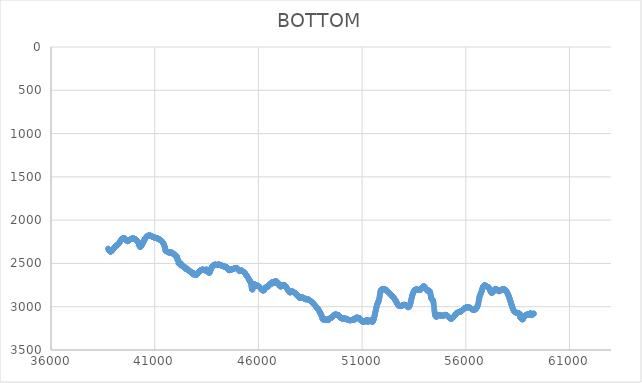
| Category | BOTTOM |
|---|---|
| 38756.673 | 2328.51 |
| 38766.9131 | 2334.84 |
| 38777.1532 | 2340.42 |
| 38787.3933 | 2345.3 |
| 38797.6334 | 2349.51 |
| 38807.8735 | 2353.06 |
| 38818.1136 | 2356 |
| 38828.3537 | 2358.34 |
| 38838.5938 | 2360.12 |
| 38848.8339 | 2361.37 |
| 38859.0741 | 2362.11 |
| 38869.3142 | 2362.38 |
| 38879.5543 | 2362.2 |
| 38889.7944 | 2361.6 |
| 38900.0345 | 2360.6 |
| 38910.2746 | 2359.25 |
| 38920.5147 | 2357.57 |
| 38930.7548 | 2355.58 |
| 38940.9949 | 2353.31 |
| 38951.235 | 2350.8 |
| 38961.4751 | 2348.07 |
| 38971.7152 | 2345.16 |
| 38981.9553 | 2342.08 |
| 38992.1954 | 2338.87 |
| 39002.4356 | 2335.55 |
| 39012.6757 | 2332.16 |
| 39022.9158 | 2328.73 |
| 39033.1559 | 2325.28 |
| 39043.396 | 2321.84 |
| 39053.6361 | 2318.44 |
| 39063.8762 | 2315.11 |
| 39074.1163 | 2311.88 |
| 39084.3564 | 2308.77 |
| 39094.5965 | 2305.82 |
| 39104.8366 | 2303.05 |
| 39115.0767 | 2300.5 |
| 39125.3168 | 2298.18 |
| 39135.557 | 2296.14 |
| 39145.7971 | 2294.38 |
| 39156.0372 | 2292.84 |
| 39166.2773 | 2291.47 |
| 39176.5174 | 2290.19 |
| 39186.7575 | 2288.92 |
| 39196.9976 | 2287.61 |
| 39207.2377 | 2286.17 |
| 39217.4778 | 2284.55 |
| 39227.7179 | 2282.67 |
| 39237.958 | 2280.45 |
| 39248.1981 | 2277.84 |
| 39258.4382 | 2274.78 |
| 39268.6783 | 2271.33 |
| 39278.9185 | 2267.57 |
| 39289.1586 | 2263.57 |
| 39299.3987 | 2259.4 |
| 39309.6388 | 2255.15 |
| 39319.8789 | 2250.89 |
| 39330.119 | 2246.7 |
| 39340.3591 | 2242.65 |
| 39350.5992 | 2238.81 |
| 39360.8393 | 2235.2 |
| 39371.0794 | 2231.81 |
| 39381.3195 | 2228.65 |
| 39391.5596 | 2225.72 |
| 39401.7997 | 2223.02 |
| 39412.0399 | 2220.55 |
| 39422.28 | 2218.33 |
| 39432.5201 | 2216.34 |
| 39442.7602 | 2214.59 |
| 39453.0003 | 2213.09 |
| 39463.2404 | 2211.83 |
| 39473.4805 | 2210.83 |
| 39483.7206 | 2210.09 |
| 39493.9607 | 2209.62 |
| 39504.2008 | 2209.42 |
| 39514.4409 | 2209.51 |
| 39524.681 | 2209.89 |
| 39534.9211 | 2210.57 |
| 39545.1612 | 2211.55 |
| 39555.4014 | 2212.85 |
| 39565.6415 | 2214.48 |
| 39575.8816 | 2216.43 |
| 39586.1217 | 2218.72 |
| 39596.3618 | 2221.34 |
| 39606.6019 | 2224.19 |
| 39616.842 | 2227.16 |
| 39627.0821 | 2230.14 |
| 39637.3222 | 2233.01 |
| 39647.5623 | 2235.67 |
| 39657.8024 | 2238.01 |
| 39668.0425 | 2239.9 |
| 39678.2826 | 2241.24 |
| 39688.5228 | 2241.95 |
| 39698.7629 | 2242.06 |
| 39709.003 | 2241.65 |
| 39719.2431 | 2240.78 |
| 39729.4832 | 2239.53 |
| 39739.7233 | 2237.96 |
| 39749.9634 | 2236.14 |
| 39760.2035 | 2234.14 |
| 39770.4436 | 2232.03 |
| 39780.6837 | 2229.89 |
| 39790.9238 | 2227.77 |
| 39801.1639 | 2225.76 |
| 39811.404 | 2223.9 |
| 39821.6442 | 2222.21 |
| 39831.8843 | 2220.67 |
| 39842.1244 | 2219.29 |
| 39852.3645 | 2218.07 |
| 39862.6046 | 2216.99 |
| 39872.8447 | 2216.05 |
| 39883.0848 | 2215.25 |
| 39893.3249 | 2214.58 |
| 39903.565 | 2214.04 |
| 39913.8051 | 2213.63 |
| 39924.0452 | 2213.34 |
| 39934.2853 | 2213.16 |
| 39944.5254 | 2213.09 |
| 39954.7655 | 2213.13 |
| 39965.0057 | 2213.28 |
| 39975.2458 | 2213.54 |
| 39985.4859 | 2213.92 |
| 39995.726 | 2214.42 |
| 40005.9661 | 2215.04 |
| 40016.2062 | 2215.79 |
| 40026.4463 | 2216.66 |
| 40036.6864 | 2217.67 |
| 40046.9265 | 2218.82 |
| 40057.1666 | 2220.11 |
| 40067.4067 | 2221.53 |
| 40077.6468 | 2223.11 |
| 40087.8869 | 2224.84 |
| 40098.1271 | 2226.71 |
| 40108.3672 | 2228.75 |
| 40118.6073 | 2230.94 |
| 40128.8474 | 2233.3 |
| 40139.0875 | 2235.82 |
| 40149.3276 | 2238.52 |
| 40159.5677 | 2241.39 |
| 40169.8078 | 2244.43 |
| 40180.0479 | 2247.65 |
| 40190.288 | 2251.06 |
| 40200.5281 | 2254.65 |
| 40210.7682 | 2258.43 |
| 40221.0083 | 2262.41 |
| 40231.2484 | 2266.58 |
| 40241.4886 | 2278.56 |
| 40251.7287 | 2288.4 |
| 40261.9688 | 2296.22 |
| 40272.2089 | 2302.16 |
| 40282.449 | 2306.38 |
| 40292.6891 | 2309 |
| 40302.9292 | 2310.17 |
| 40313.1693 | 2310.04 |
| 40323.4094 | 2308.73 |
| 40333.6495 | 2306.4 |
| 40343.8896 | 2303.18 |
| 40354.1297 | 2299.21 |
| 40364.3698 | 2294.64 |
| 40374.61 | 2289.6 |
| 40384.8501 | 2284.24 |
| 40395.0902 | 2278.69 |
| 40405.3303 | 2273.1 |
| 40415.5704 | 2267.61 |
| 40425.8105 | 2262.36 |
| 40436.0506 | 2257.44 |
| 40446.2907 | 2252.83 |
| 40456.5308 | 2248.42 |
| 40466.7709 | 2244.14 |
| 40477.011 | 2239.9 |
| 40487.2511 | 2235.61 |
| 40497.4912 | 2231.22 |
| 40507.7313 | 2226.76 |
| 40517.9715 | 2222.28 |
| 40528.2116 | 2217.86 |
| 40538.4517 | 2213.54 |
| 40548.6918 | 2209.39 |
| 40558.9319 | 2205.47 |
| 40569.172 | 2201.83 |
| 40579.4121 | 2198.52 |
| 40589.6522 | 2195.54 |
| 40599.8923 | 2192.87 |
| 40610.1324 | 2190.49 |
| 40620.3725 | 2188.39 |
| 40630.6126 | 2186.54 |
| 40640.8527 | 2184.93 |
| 40651.0929 | 2183.55 |
| 40661.333 | 2182.36 |
| 40671.5731 | 2181.36 |
| 40681.8132 | 2180.53 |
| 40692.0533 | 2179.85 |
| 40702.2934 | 2179.31 |
| 40712.5335 | 2178.88 |
| 40722.7736 | 2178.57 |
| 40733.0137 | 2178.37 |
| 40743.2538 | 2178.3 |
| 40753.4939 | 2178.34 |
| 40763.734 | 2178.51 |
| 40773.9741 | 2178.8 |
| 40784.2143 | 2179.21 |
| 40794.4544 | 2179.75 |
| 40804.6945 | 2180.41 |
| 40814.9346 | 2181.2 |
| 40825.1747 | 2182.12 |
| 40835.4148 | 2183.17 |
| 40845.6549 | 2184.33 |
| 40855.895 | 2185.57 |
| 40866.1351 | 2186.89 |
| 40876.3752 | 2188.26 |
| 40886.6153 | 2189.66 |
| 40896.8554 | 2191.07 |
| 40907.0955 | 2192.47 |
| 40917.3356 | 2193.85 |
| 40927.5758 | 2195.17 |
| 40937.8159 | 2196.43 |
| 40948.056 | 2197.61 |
| 40958.2961 | 2198.67 |
| 40968.5362 | 2199.65 |
| 40978.7763 | 2200.53 |
| 40989.0164 | 2201.35 |
| 40999.2565 | 2202.09 |
| 41009.4966 | 2202.78 |
| 41019.7367 | 2203.43 |
| 41029.9768 | 2204.05 |
| 41040.2169 | 2204.64 |
| 41050.457 | 2205.22 |
| 41060.6972 | 2205.8 |
| 41070.9373 | 2206.39 |
| 41081.1774 | 2207 |
| 41091.4175 | 2207.64 |
| 41101.6576 | 2208.33 |
| 41111.8977 | 2209.06 |
| 41122.1378 | 2209.86 |
| 41132.3779 | 2210.73 |
| 41142.618 | 2211.68 |
| 41152.8581 | 2212.73 |
| 41163.0982 | 2213.86 |
| 41173.3383 | 2215.08 |
| 41183.5784 | 2216.38 |
| 41193.8185 | 2217.75 |
| 41204.0587 | 2219.18 |
| 41214.2988 | 2220.68 |
| 41224.5389 | 2222.23 |
| 41234.779 | 2223.83 |
| 41245.0191 | 2225.48 |
| 41255.2592 | 2227.17 |
| 41265.4993 | 2228.89 |
| 41275.7394 | 2230.64 |
| 41285.9795 | 2232.41 |
| 41296.2196 | 2234.2 |
| 41306.4597 | 2236.01 |
| 41316.6998 | 2237.88 |
| 41326.9399 | 2239.83 |
| 41337.1801 | 2241.92 |
| 41347.4202 | 2244.19 |
| 41357.6603 | 2246.67 |
| 41367.9004 | 2249.41 |
| 41378.1405 | 2252.45 |
| 41388.3806 | 2255.83 |
| 41398.6207 | 2259.59 |
| 41408.8608 | 2263.77 |
| 41419.1009 | 2268.41 |
| 41429.341 | 2273.56 |
| 41439.5811 | 2279.25 |
| 41449.8212 | 2285.52 |
| 41460.0613 | 2292.42 |
| 41470.3015 | 2299.99 |
| 41480.5416 | 2308.27 |
| 41490.7817 | 2317.29 |
| 41501.0218 | 2327.11 |
| 41511.2619 | 2345.41 |
| 41521.502 | 2353.85 |
| 41531.7421 | 2353.85 |
| 41541.9822 | 2353.85 |
| 41552.2223 | 2356.67 |
| 41562.4624 | 2356.67 |
| 41572.7025 | 2358.07 |
| 41582.9426 | 2360.89 |
| 41593.1827 | 2363.7 |
| 41603.4228 | 2365.11 |
| 41613.663 | 2366.52 |
| 41623.9031 | 2365.11 |
| 41634.1432 | 2367.93 |
| 41644.3833 | 2369.33 |
| 41654.6234 | 2372.15 |
| 41664.8635 | 2372.15 |
| 41675.1036 | 2372.15 |
| 41685.3437 | 2372.15 |
| 41695.5838 | 2372.15 |
| 41705.8239 | 2372.15 |
| 41716.064 | 2372.15 |
| 41726.3041 | 2372.15 |
| 41736.5442 | 2372.15 |
| 41746.7844 | 2373.56 |
| 41757.0245 | 2373.56 |
| 41767.2646 | 2377.78 |
| 41777.5047 | 2377.78 |
| 41787.7448 | 2372.15 |
| 41797.9849 | 2372.15 |
| 41808.225 | 2377.78 |
| 41818.4651 | 2377.78 |
| 41828.7052 | 2376.37 |
| 41838.9453 | 2377.78 |
| 41849.1854 | 2377.78 |
| 41859.4255 | 2379.19 |
| 41869.6656 | 2380.6 |
| 41879.9057 | 2383.41 |
| 41890.1459 | 2393.26 |
| 41900.386 | 2393.26 |
| 41910.6261 | 2393.26 |
| 41920.8662 | 2390.45 |
| 41931.1063 | 2393.26 |
| 41941.3464 | 2397.49 |
| 41951.5865 | 2397.49 |
| 41961.8266 | 2400.3 |
| 41972.0667 | 2404.53 |
| 41982.3068 | 2405.93 |
| 41992.5469 | 2404.53 |
| 42002.787 | 2414.38 |
| 42013.0271 | 2412.97 |
| 42023.2673 | 2417.19 |
| 42033.5074 | 2420.01 |
| 42043.7475 | 2428.45 |
| 42053.9876 | 2421.42 |
| 42064.2277 | 2422.82 |
| 42074.4678 | 2422.82 |
| 42084.7079 | 2429.86 |
| 42094.948 | 2458.01 |
| 42105.1881 | 2458.01 |
| 42115.4282 | 2459.42 |
| 42125.6683 | 2460.83 |
| 42135.9084 | 2460.83 |
| 42146.1485 | 2498.84 |
| 42156.3887 | 2498.84 |
| 42166.6288 | 2496.02 |
| 42176.8689 | 2496.02 |
| 42187.109 | 2497.43 |
| 42197.3491 | 2497.43 |
| 42207.5892 | 2498.84 |
| 42217.8293 | 2507.28 |
| 42228.0694 | 2500.24 |
| 42238.3095 | 2497.43 |
| 42248.5496 | 2522.76 |
| 42258.7897 | 2500.24 |
| 42269.0298 | 2510.1 |
| 42279.2699 | 2519.95 |
| 42289.51 | 2507.28 |
| 42299.7502 | 2524.17 |
| 42309.9903 | 2524.17 |
| 42320.2304 | 2524.17 |
| 42330.4705 | 2524.17 |
| 42340.7106 | 2528.4 |
| 42350.9507 | 2529.8 |
| 42361.1908 | 2529.8 |
| 42371.4309 | 2528.4 |
| 42381.671 | 2534.03 |
| 42391.9111 | 2535.43 |
| 42402.1512 | 2543.88 |
| 42412.3913 | 2545.29 |
| 42422.6314 | 2546.69 |
| 42432.8716 | 2548.1 |
| 42443.1117 | 2549.51 |
| 42453.3518 | 2545.29 |
| 42463.5919 | 2553.73 |
| 42473.832 | 2560.77 |
| 42484.0721 | 2545.29 |
| 42494.3122 | 2562.18 |
| 42504.5523 | 2560.77 |
| 42514.7924 | 2560.77 |
| 42525.0325 | 2560.77 |
| 42535.2726 | 2562.18 |
| 42545.5127 | 2562.18 |
| 42555.7528 | 2567.81 |
| 42565.993 | 2569.22 |
| 42576.2331 | 2569.22 |
| 42586.4732 | 2570.62 |
| 42596.7133 | 2570.62 |
| 42606.9534 | 2572.03 |
| 42617.1935 | 2572.03 |
| 42627.4336 | 2573.44 |
| 42637.6737 | 2574.85 |
| 42647.9138 | 2584.7 |
| 42658.1539 | 2586.11 |
| 42668.394 | 2587.52 |
| 42678.6341 | 2587.52 |
| 42688.8742 | 2587.52 |
| 42699.1143 | 2590.33 |
| 42709.3545 | 2593.15 |
| 42719.5946 | 2595.96 |
| 42729.8347 | 2595.96 |
| 42740.0748 | 2597.37 |
| 42750.3149 | 2597.37 |
| 42760.555 | 2598.78 |
| 42770.7951 | 2598.78 |
| 42781.0352 | 2601.59 |
| 42791.2753 | 2610.04 |
| 42801.5154 | 2604.41 |
| 42811.7555 | 2607.22 |
| 42821.9956 | 2607.22 |
| 42832.2357 | 2626.93 |
| 42842.4759 | 2610.04 |
| 42852.716 | 2610.04 |
| 42862.9561 | 2610.04 |
| 42873.1962 | 2610.04 |
| 42883.4363 | 2612.85 |
| 42893.6764 | 2622.71 |
| 42903.9165 | 2626.93 |
| 42914.1566 | 2626.93 |
| 42924.3967 | 2628.34 |
| 42934.6368 | 2628.34 |
| 42944.8769 | 2628.34 |
| 42955.117 | 2628.34 |
| 42965.3571 | 2631.15 |
| 42975.5973 | 2631.15 |
| 42985.8374 | 2629.74 |
| 42996.0775 | 2628.34 |
| 43006.3176 | 2629.74 |
| 43016.5577 | 2631.15 |
| 43026.7978 | 2628.05 |
| 43037.0379 | 2624.98 |
| 43047.278 | 2621.93 |
| 43057.5181 | 2618.91 |
| 43067.7582 | 2615.93 |
| 43077.9983 | 2613 |
| 43088.2384 | 2610.12 |
| 43098.4785 | 2607.3 |
| 43108.7186 | 2604.54 |
| 43118.9588 | 2601.85 |
| 43129.1989 | 2599.23 |
| 43139.439 | 2596.7 |
| 43149.6791 | 2594.25 |
| 43159.9192 | 2591.91 |
| 43170.1593 | 2589.66 |
| 43180.3994 | 2587.52 |
| 43190.6395 | 2585.49 |
| 43200.8796 | 2583.58 |
| 43211.1197 | 2581.79 |
| 43221.3598 | 2580.14 |
| 43231.5999 | 2578.63 |
| 43241.84 | 2577.25 |
| 43252.0802 | 2576.03 |
| 43262.3203 | 2574.97 |
| 43272.5604 | 2574.07 |
| 43282.8005 | 2573.33 |
| 43293.0406 | 2572.77 |
| 43303.2807 | 2572.4 |
| 43313.5208 | 2572.21 |
| 43323.7609 | 2572.21 |
| 43334.001 | 2572.41 |
| 43344.2411 | 2572.82 |
| 43354.4812 | 2573.44 |
| 43364.7213 | 2574.26 |
| 43374.9614 | 2575.24 |
| 43385.2015 | 2576.3 |
| 43395.4417 | 2577.38 |
| 43405.6818 | 2578.41 |
| 43415.9219 | 2579.32 |
| 43426.162 | 2580.05 |
| 43436.4021 | 2580.53 |
| 43446.6422 | 2580.7 |
| 43456.8823 | 2580.48 |
| 43467.1224 | 2575.5 |
| 43477.3625 | 2572.39 |
| 43487.6026 | 2570.93 |
| 43497.8427 | 2570.92 |
| 43508.0828 | 2572.15 |
| 43518.3229 | 2574.4 |
| 43528.5631 | 2577.48 |
| 43538.8032 | 2581.17 |
| 43549.0433 | 2585.27 |
| 43559.2834 | 2589.57 |
| 43569.5235 | 2593.86 |
| 43579.7636 | 2597.94 |
| 43590.0037 | 2601.59 |
| 43600.2438 | 2604.61 |
| 43610.4839 | 2606.8 |
| 43620.724 | 2607.94 |
| 43630.9641 | 2607.82 |
| 43641.2042 | 2606.24 |
| 43651.4443 | 2603 |
| 43661.6845 | 2598.01 |
| 43671.9246 | 2591.73 |
| 43682.1647 | 2584.75 |
| 43692.4048 | 2577.66 |
| 43702.6449 | 2570.94 |
| 43712.885 | 2564.69 |
| 43723.1251 | 2558.88 |
| 43733.3652 | 2553.5 |
| 43743.6053 | 2548.54 |
| 43753.8454 | 2543.99 |
| 43764.0855 | 2539.83 |
| 43774.3256 | 2536.04 |
| 43784.5657 | 2532.62 |
| 43794.8058 | 2529.54 |
| 43805.046 | 2526.81 |
| 43815.2861 | 2524.39 |
| 43825.5262 | 2522.28 |
| 43835.7663 | 2520.47 |
| 43846.0064 | 2518.93 |
| 43856.2465 | 2517.66 |
| 43866.4866 | 2516.64 |
| 43876.7267 | 2515.86 |
| 43886.9668 | 2515.3 |
| 43897.2069 | 2514.95 |
| 43907.447 | 2514.8 |
| 43917.6871 | 2514.83 |
| 43927.9272 | 2515.03 |
| 43938.1674 | 2515.38 |
| 43948.4075 | 2515.87 |
| 43958.6476 | 2516.49 |
| 43968.8877 | 2517.22 |
| 43979.1278 | 2518.05 |
| 43989.3679 | 2518.97 |
| 43999.608 | 2519.95 |
| 44009.8481 | 2518.25 |
| 44020.0882 | 2516.84 |
| 44030.3283 | 2515.71 |
| 44040.5684 | 2514.83 |
| 44050.8085 | 2514.19 |
| 44061.0486 | 2513.78 |
| 44071.2888 | 2513.57 |
| 44081.5289 | 2513.56 |
| 44091.769 | 2513.72 |
| 44102.0091 | 2514.04 |
| 44112.2492 | 2514.5 |
| 44122.4893 | 2515.09 |
| 44132.7294 | 2515.79 |
| 44142.9695 | 2516.58 |
| 44153.2096 | 2517.44 |
| 44163.4497 | 2518.37 |
| 44173.6898 | 2519.34 |
| 44183.9299 | 2520.35 |
| 44194.17 | 2521.36 |
| 44204.4101 | 2522.37 |
| 44214.6503 | 2523.37 |
| 44224.8904 | 2524.36 |
| 44235.1305 | 2525.35 |
| 44245.3706 | 2526.32 |
| 44255.6107 | 2527.27 |
| 44265.8508 | 2528.21 |
| 44276.0909 | 2529.13 |
| 44286.331 | 2530.03 |
| 44296.5711 | 2530.9 |
| 44306.8112 | 2531.75 |
| 44317.0513 | 2532.58 |
| 44327.2914 | 2533.37 |
| 44337.5315 | 2534.14 |
| 44347.7717 | 2534.87 |
| 44358.0118 | 2535.56 |
| 44368.2519 | 2536.22 |
| 44378.492 | 2536.84 |
| 44388.7321 | 2537.43 |
| 44398.9722 | 2538.01 |
| 44409.2123 | 2538.63 |
| 44419.4524 | 2539.32 |
| 44429.6925 | 2540.13 |
| 44439.9326 | 2541.09 |
| 44450.1727 | 2542.24 |
| 44460.4128 | 2543.61 |
| 44470.6529 | 2545.26 |
| 44480.8931 | 2547.21 |
| 44491.1332 | 2549.51 |
| 44501.3733 | 2555.61 |
| 44511.6134 | 2560.83 |
| 44521.8535 | 2565.24 |
| 44532.0936 | 2568.89 |
| 44542.3337 | 2571.83 |
| 44552.5738 | 2574.12 |
| 44562.8139 | 2575.82 |
| 44573.054 | 2576.98 |
| 44583.2941 | 2577.66 |
| 44593.5342 | 2577.91 |
| 44603.7743 | 2577.79 |
| 44614.0144 | 2577.36 |
| 44624.2546 | 2576.66 |
| 44634.4947 | 2575.77 |
| 44644.7348 | 2574.72 |
| 44654.9749 | 2573.58 |
| 44665.215 | 2572.4 |
| 44675.4551 | 2571.25 |
| 44685.6952 | 2570.17 |
| 44695.9353 | 2569.22 |
| 44706.1754 | 2568.43 |
| 44716.4155 | 2567.79 |
| 44726.6556 | 2567.24 |
| 44736.8957 | 2566.73 |
| 44747.1358 | 2566.22 |
| 44757.376 | 2565.66 |
| 44767.6161 | 2564.99 |
| 44777.8562 | 2564.2 |
| 44788.0963 | 2563.28 |
| 44798.3364 | 2562.26 |
| 44808.5765 | 2561.17 |
| 44818.8166 | 2560.03 |
| 44829.0567 | 2558.86 |
| 44839.2968 | 2557.69 |
| 44849.5369 | 2556.55 |
| 44859.777 | 2555.45 |
| 44870.0171 | 2554.44 |
| 44880.2572 | 2553.55 |
| 44890.4974 | 2552.81 |
| 44900.7375 | 2552.27 |
| 44910.9776 | 2551.96 |
| 44921.2177 | 2551.92 |
| 44931.4578 | 2552.18 |
| 44941.6979 | 2552.79 |
| 44951.938 | 2553.77 |
| 44962.1781 | 2555.17 |
| 44972.4182 | 2557.02 |
| 44982.6583 | 2559.36 |
| 44992.8984 | 2562.2 |
| 45003.1385 | 2565.41 |
| 45013.3786 | 2568.86 |
| 45023.6188 | 2572.39 |
| 45033.8589 | 2575.85 |
| 45044.099 | 2579.1 |
| 45054.3391 | 2582 |
| 45064.5792 | 2584.38 |
| 45074.8193 | 2586.11 |
| 45085.0594 | 2587.08 |
| 45095.2995 | 2587.38 |
| 45105.5396 | 2587.15 |
| 45115.7797 | 2586.51 |
| 45126.0198 | 2585.59 |
| 45136.2599 | 2584.55 |
| 45146.5 | 2583.49 |
| 45156.7401 | 2582.57 |
| 45166.9803 | 2581.9 |
| 45177.2204 | 2581.63 |
| 45187.4605 | 2581.88 |
| 45197.7006 | 2582.75 |
| 45207.9407 | 2584.09 |
| 45218.1808 | 2585.74 |
| 45228.4209 | 2587.52 |
| 45238.661 | 2589.27 |
| 45248.9011 | 2591 |
| 45259.1412 | 2592.72 |
| 45269.3813 | 2594.48 |
| 45279.6214 | 2596.29 |
| 45289.8615 | 2598.19 |
| 45300.1017 | 2600.2 |
| 45310.3418 | 2602.34 |
| 45320.5819 | 2604.65 |
| 45330.822 | 2607.16 |
| 45341.0621 | 2609.88 |
| 45351.3022 | 2612.85 |
| 45361.5423 | 2616.09 |
| 45371.7824 | 2619.55 |
| 45382.0225 | 2623.19 |
| 45392.2626 | 2626.95 |
| 45402.5027 | 2630.79 |
| 45412.7428 | 2634.67 |
| 45422.9829 | 2638.52 |
| 45433.2231 | 2642.3 |
| 45443.4632 | 2645.96 |
| 45453.7033 | 2649.45 |
| 45463.9434 | 2652.74 |
| 45474.1835 | 2655.87 |
| 45484.4236 | 2658.88 |
| 45494.6637 | 2661.83 |
| 45504.9038 | 2664.77 |
| 45515.1439 | 2667.75 |
| 45525.384 | 2676.89 |
| 45535.6241 | 2683.75 |
| 45545.8642 | 2688.78 |
| 45556.1043 | 2692.45 |
| 45566.3444 | 2695.2 |
| 45576.5846 | 2697.5 |
| 45586.8247 | 2699.82 |
| 45597.0648 | 2702.59 |
| 45607.3049 | 2706.3 |
| 45617.545 | 2711.39 |
| 45627.7851 | 2718.32 |
| 45638.0252 | 2727.55 |
| 45648.2653 | 2739.54 |
| 45658.5054 | 2754.31 |
| 45668.7455 | 2770.17 |
| 45678.9856 | 2784.98 |
| 45689.2257 | 2796.59 |
| 45699.4658 | 2802.88 |
| 45709.706 | 2802.37 |
| 45719.9461 | 2796.23 |
| 45730.1862 | 2786.3 |
| 45740.4263 | 2774.43 |
| 45750.6664 | 2762.45 |
| 45760.9065 | 2752.21 |
| 45771.1466 | 2745.13 |
| 45781.3867 | 2741.09 |
| 45791.6268 | 2739.56 |
| 45801.8669 | 2740 |
| 45812.107 | 2741.87 |
| 45822.3471 | 2744.65 |
| 45832.5872 | 2747.81 |
| 45842.8274 | 2750.8 |
| 45853.0675 | 2753.2 |
| 45863.3076 | 2754.99 |
| 45873.5477 | 2756.25 |
| 45883.7878 | 2757.06 |
| 45894.0279 | 2757.51 |
| 45904.268 | 2757.68 |
| 45914.5081 | 2757.64 |
| 45924.7482 | 2757.49 |
| 45934.9883 | 2757.3 |
| 45945.2284 | 2757.16 |
| 45955.4685 | 2757.15 |
| 45965.7086 | 2757.35 |
| 45975.9487 | 2757.84 |
| 45986.1889 | 2758.69 |
| 45996.429 | 2759.88 |
| 46006.6691 | 2761.39 |
| 46016.9092 | 2763.2 |
| 46027.1493 | 2765.26 |
| 46037.3894 | 2767.55 |
| 46047.6295 | 2770.05 |
| 46057.8696 | 2772.72 |
| 46068.1097 | 2775.54 |
| 46078.3498 | 2778.48 |
| 46088.5899 | 2781.5 |
| 46098.83 | 2784.58 |
| 46109.0701 | 2787.69 |
| 46119.3103 | 2790.79 |
| 46129.5504 | 2793.84 |
| 46139.7905 | 2796.79 |
| 46150.0306 | 2799.61 |
| 46160.2707 | 2802.25 |
| 46170.5108 | 2804.67 |
| 46180.7509 | 2806.83 |
| 46190.991 | 2808.68 |
| 46201.2311 | 2810.2 |
| 46211.4712 | 2811.33 |
| 46221.7113 | 2812.03 |
| 46231.9514 | 2812.26 |
| 46242.1915 | 2811.98 |
| 46252.4317 | 2811.15 |
| 46262.6718 | 2809.72 |
| 46272.9119 | 2807.66 |
| 46283.152 | 2804.93 |
| 46293.3921 | 2801.47 |
| 46303.6322 | 2787.4 |
| 46313.8723 | 2787.4 |
| 46324.1124 | 2781.77 |
| 46334.3525 | 2781.77 |
| 46344.5926 | 2781.77 |
| 46354.8327 | 2776.14 |
| 46365.0728 | 2774.73 |
| 46375.3129 | 2774.73 |
| 46385.553 | 2774.73 |
| 46395.7932 | 2771.91 |
| 46406.0333 | 2770.51 |
| 46416.2734 | 2770.51 |
| 46426.5135 | 2767.69 |
| 46436.7536 | 2766.28 |
| 46446.9937 | 2767.69 |
| 46457.2338 | 2762.06 |
| 46467.4739 | 2770.51 |
| 46477.714 | 2752.21 |
| 46487.9541 | 2750.8 |
| 46498.1942 | 2747.98 |
| 46508.4343 | 2747.98 |
| 46518.6744 | 2745.17 |
| 46528.9146 | 2743.76 |
| 46539.1547 | 2742.35 |
| 46549.3948 | 2740.95 |
| 46559.6349 | 2739.54 |
| 46569.875 | 2738.13 |
| 46580.1151 | 2738.13 |
| 46590.3552 | 2736.72 |
| 46600.5953 | 2735.31 |
| 46610.8354 | 2733.91 |
| 46621.0755 | 2724.05 |
| 46631.3156 | 2740.95 |
| 46641.5557 | 2719.83 |
| 46651.7958 | 2718.42 |
| 46662.036 | 2717.02 |
| 46672.2761 | 2721.24 |
| 46682.5162 | 2719.83 |
| 46692.7563 | 2719.83 |
| 46702.9964 | 2717.02 |
| 46713.2365 | 2718.42 |
| 46723.4766 | 2718.42 |
| 46733.7167 | 2715.61 |
| 46743.9568 | 2715.61 |
| 46754.1969 | 2715.61 |
| 46764.437 | 2715.61 |
| 46774.6771 | 2721.24 |
| 46784.9172 | 2722.65 |
| 46795.1574 | 2724.05 |
| 46805.3975 | 2704.35 |
| 46815.6376 | 2705.75 |
| 46825.8777 | 2707.16 |
| 46836.1178 | 2708.57 |
| 46846.3579 | 2711.39 |
| 46856.598 | 2712.79 |
| 46866.8381 | 2704.35 |
| 46877.0782 | 2717.02 |
| 46887.3183 | 2718.42 |
| 46897.5584 | 2722.65 |
| 46907.7985 | 2729.68 |
| 46918.0386 | 2728.28 |
| 46928.2787 | 2731.09 |
| 46938.5189 | 2729.68 |
| 46948.759 | 2729.68 |
| 46958.9991 | 2728.28 |
| 46969.2392 | 2735.31 |
| 46979.4793 | 2735.31 |
| 46989.7194 | 2740.95 |
| 46999.9595 | 2747.31 |
| 47010.1996 | 2752.55 |
| 47020.4397 | 2756.76 |
| 47030.6798 | 2760.02 |
| 47040.9199 | 2762.41 |
| 47051.16 | 2764 |
| 47061.4001 | 2764.89 |
| 47071.6403 | 2765.15 |
| 47081.8804 | 2764.87 |
| 47092.1205 | 2764.13 |
| 47102.3606 | 2763.01 |
| 47112.6007 | 2761.59 |
| 47122.8408 | 2759.96 |
| 47133.0809 | 2758.19 |
| 47143.321 | 2756.38 |
| 47153.5611 | 2754.59 |
| 47163.8012 | 2752.92 |
| 47174.0413 | 2751.44 |
| 47184.2814 | 2750.23 |
| 47194.5215 | 2749.39 |
| 47204.7617 | 2748.97 |
| 47215.0018 | 2748.97 |
| 47225.2419 | 2749.37 |
| 47235.482 | 2750.14 |
| 47245.7221 | 2751.27 |
| 47255.9622 | 2752.73 |
| 47266.2023 | 2754.51 |
| 47276.4424 | 2756.57 |
| 47286.6825 | 2758.91 |
| 47296.9226 | 2761.49 |
| 47307.1627 | 2764.3 |
| 47317.4028 | 2767.31 |
| 47327.6429 | 2770.51 |
| 47337.8831 | 2773.86 |
| 47348.1232 | 2777.37 |
| 47358.3633 | 2781 |
| 47368.6034 | 2784.74 |
| 47378.8435 | 2788.58 |
| 47389.0836 | 2792.5 |
| 47399.3237 | 2796.49 |
| 47409.5638 | 2800.52 |
| 47419.8039 | 2804.58 |
| 47430.044 | 2808.66 |
| 47440.2841 | 2812.73 |
| 47450.5242 | 2816.77 |
| 47460.7643 | 2820.67 |
| 47471.0044 | 2824.31 |
| 47481.2446 | 2827.57 |
| 47491.4847 | 2830.33 |
| 47501.7248 | 2832.46 |
| 47511.9649 | 2833.85 |
| 47522.205 | 2834.42 |
| 47532.4451 | 2834.26 |
| 47542.6852 | 2833.54 |
| 47552.9253 | 2832.39 |
| 47563.1654 | 2830.96 |
| 47573.4055 | 2829.4 |
| 47583.6456 | 2827.86 |
| 47593.8857 | 2826.48 |
| 47604.1258 | 2825.4 |
| 47614.366 | 2824.75 |
| 47624.6061 | 2824.52 |
| 47634.8462 | 2824.67 |
| 47645.0863 | 2825.16 |
| 47655.3264 | 2825.95 |
| 47665.5665 | 2827.01 |
| 47675.8066 | 2828.3 |
| 47686.0467 | 2829.77 |
| 47696.2868 | 2831.41 |
| 47706.5269 | 2833.15 |
| 47716.767 | 2834.98 |
| 47727.0071 | 2836.84 |
| 47737.2472 | 2838.71 |
| 47747.4874 | 2840.54 |
| 47757.7275 | 2842.29 |
| 47767.9676 | 2843.95 |
| 47778.2077 | 2845.54 |
| 47788.4478 | 2847.09 |
| 47798.6879 | 2848.66 |
| 47808.928 | 2850.27 |
| 47819.1681 | 2851.96 |
| 47829.4082 | 2853.79 |
| 47839.6483 | 2855.78 |
| 47849.8884 | 2857.98 |
| 47860.1285 | 2860.43 |
| 47870.3686 | 2863.16 |
| 47880.6087 | 2866.22 |
| 47890.8489 | 2869.62 |
| 47901.089 | 2873.26 |
| 47911.3291 | 2877.01 |
| 47921.5692 | 2880.74 |
| 47931.8093 | 2884.33 |
| 47942.0494 | 2887.65 |
| 47952.2895 | 2890.57 |
| 47962.5296 | 2892.97 |
| 47972.7697 | 2894.75 |
| 47983.0098 | 2895.95 |
| 47993.2499 | 2896.65 |
| 48003.49 | 2896.93 |
| 48013.7301 | 2896.85 |
| 48023.9703 | 2896.51 |
| 48034.2104 | 2895.97 |
| 48044.4505 | 2895.31 |
| 48054.6906 | 2894.6 |
| 48064.9307 | 2893.92 |
| 48075.1708 | 2893.35 |
| 48085.4109 | 2892.97 |
| 48095.651 | 2892.82 |
| 48105.8911 | 2892.92 |
| 48116.1312 | 2893.25 |
| 48126.3713 | 2893.78 |
| 48136.6114 | 2894.51 |
| 48146.8515 | 2895.42 |
| 48157.0917 | 2896.48 |
| 48167.3318 | 2897.69 |
| 48177.5719 | 2899.02 |
| 48187.812 | 2900.47 |
| 48198.0521 | 2902.01 |
| 48208.2922 | 2903.63 |
| 48218.5323 | 2905.32 |
| 48228.7724 | 2907.04 |
| 48239.0125 | 2908.8 |
| 48249.2526 | 2910.57 |
| 48259.4927 | 2912.34 |
| 48269.7328 | 2914.08 |
| 48279.9729 | 2913.49 |
| 48290.2131 | 2913.05 |
| 48300.4532 | 2912.74 |
| 48310.6933 | 2912.57 |
| 48320.9334 | 2912.53 |
| 48331.1735 | 2912.62 |
| 48341.4136 | 2912.84 |
| 48351.6537 | 2913.19 |
| 48361.8938 | 2913.65 |
| 48372.1339 | 2914.23 |
| 48382.374 | 2914.93 |
| 48392.6141 | 2915.74 |
| 48402.8542 | 2916.65 |
| 48413.0943 | 2917.68 |
| 48423.3345 | 2918.8 |
| 48433.5746 | 2920.03 |
| 48443.8147 | 2921.35 |
| 48454.0548 | 2922.77 |
| 48464.2949 | 2924.28 |
| 48474.535 | 2925.88 |
| 48484.7751 | 2927.56 |
| 48495.0152 | 2929.32 |
| 48505.2553 | 2931.17 |
| 48515.4954 | 2933.09 |
| 48525.7355 | 2935.08 |
| 48535.9756 | 2937.14 |
| 48546.2157 | 2939.27 |
| 48556.4558 | 2941.47 |
| 48566.696 | 2943.72 |
| 48576.9361 | 2946.03 |
| 48587.1762 | 2948.4 |
| 48597.4163 | 2950.82 |
| 48607.6564 | 2953.29 |
| 48617.8965 | 2955.81 |
| 48628.1366 | 2958.37 |
| 48638.3767 | 2960.97 |
| 48648.6168 | 2963.61 |
| 48658.8569 | 2966.28 |
| 48669.097 | 2968.98 |
| 48679.3371 | 2971.71 |
| 48689.5772 | 2974.47 |
| 48699.8174 | 2977.24 |
| 48710.0575 | 2980.04 |
| 48720.2976 | 2982.86 |
| 48730.5377 | 2985.68 |
| 48740.7778 | 2988.52 |
| 48751.0179 | 2991.37 |
| 48761.258 | 2994.22 |
| 48771.4981 | 2997.07 |
| 48781.7382 | 2999.92 |
| 48791.9783 | 3002.76 |
| 48802.2184 | 3005.6 |
| 48812.4585 | 3008.46 |
| 48822.6986 | 3011.34 |
| 48832.9388 | 3014.28 |
| 48843.1789 | 3017.29 |
| 48853.419 | 3020.4 |
| 48863.6591 | 3023.61 |
| 48873.8992 | 3026.96 |
| 48884.1393 | 3030.46 |
| 48894.3794 | 3034.14 |
| 48904.6195 | 3038 |
| 48914.8596 | 3042.08 |
| 48925.0997 | 3046.4 |
| 48935.3398 | 3050.95 |
| 48945.5799 | 3055.69 |
| 48955.82 | 3060.57 |
| 48966.0601 | 3065.52 |
| 48976.3003 | 3070.48 |
| 48986.5404 | 3075.38 |
| 48996.7805 | 3080.18 |
| 49007.0206 | 3084.85 |
| 49017.2607 | 3089.55 |
| 49027.5008 | 3094.5 |
| 49037.7409 | 3099.89 |
| 49047.981 | 3105.93 |
| 49058.2211 | 3112.82 |
| 49068.4612 | 3120.78 |
| 49078.7013 | 3130.01 |
| 49088.9414 | 3140.71 |
| 49099.1815 | 3142.12 |
| 49109.4217 | 3146.34 |
| 49119.6618 | 3147.75 |
| 49129.9019 | 3146.34 |
| 49140.142 | 3146.34 |
| 49150.3821 | 3146.34 |
| 49160.6222 | 3146.34 |
| 49170.8623 | 3146.34 |
| 49181.1024 | 3146.34 |
| 49191.3425 | 3146.34 |
| 49201.5826 | 3146.34 |
| 49211.8227 | 3149.15 |
| 49222.0628 | 3149.15 |
| 49232.3029 | 3149.15 |
| 49242.5431 | 3150.56 |
| 49252.7832 | 3150.56 |
| 49263.0233 | 3150.56 |
| 49273.2634 | 3150.56 |
| 49283.5035 | 3150.56 |
| 49293.7436 | 3151.97 |
| 49303.9837 | 3151.97 |
| 49314.2238 | 3151.97 |
| 49324.4639 | 3151.97 |
| 49334.704 | 3151.97 |
| 49344.9441 | 3151.97 |
| 49355.1842 | 3150.56 |
| 49365.4243 | 3154.78 |
| 49375.6645 | 3151.04 |
| 49385.9046 | 3147.74 |
| 49396.1447 | 3144.85 |
| 49406.3848 | 3142.32 |
| 49416.6249 | 3140.11 |
| 49426.865 | 3138.19 |
| 49437.1051 | 3136.5 |
| 49447.3452 | 3135.01 |
| 49457.5853 | 3133.67 |
| 49467.8254 | 3132.45 |
| 49478.0655 | 3131.29 |
| 49488.3056 | 3130.17 |
| 49498.5457 | 3129.03 |
| 49508.7859 | 3127.84 |
| 49519.026 | 3126.55 |
| 49529.2661 | 3125.12 |
| 49539.5062 | 3123.52 |
| 49549.7463 | 3121.69 |
| 49559.9864 | 3119.59 |
| 49570.2265 | 3117.21 |
| 49580.4666 | 3114.6 |
| 49590.7067 | 3111.83 |
| 49600.9468 | 3108.98 |
| 49611.1869 | 3106.12 |
| 49621.427 | 3103.32 |
| 49631.6671 | 3100.66 |
| 49641.9072 | 3098.22 |
| 49652.1474 | 3096.06 |
| 49662.3875 | 3094.26 |
| 49672.6276 | 3092.87 |
| 49682.8677 | 3091.88 |
| 49693.1078 | 3091.23 |
| 49703.3479 | 3090.89 |
| 49713.588 | 3090.81 |
| 49723.8281 | 3090.94 |
| 49734.0682 | 3091.25 |
| 49744.3083 | 3091.68 |
| 49754.5484 | 3092.2 |
| 49764.7885 | 3092.76 |
| 49775.0286 | 3093.32 |
| 49785.2688 | 3093.83 |
| 49795.5089 | 3094.26 |
| 49805.749 | 3094.57 |
| 49815.9891 | 3094.83 |
| 49826.2292 | 3095.14 |
| 49836.4693 | 3095.58 |
| 49846.7094 | 3096.22 |
| 49856.9495 | 3097.17 |
| 49867.1896 | 3098.51 |
| 49877.4297 | 3100.33 |
| 49887.6698 | 3102.7 |
| 49897.9099 | 3105.68 |
| 49908.15 | 3109.12 |
| 49918.3902 | 3112.83 |
| 49928.6303 | 3116.63 |
| 49938.8704 | 3120.32 |
| 49949.1105 | 3123.72 |
| 49959.3506 | 3126.63 |
| 49969.5907 | 3128.93 |
| 49979.8308 | 3130.66 |
| 49990.0709 | 3131.96 |
| 50000.311 | 3132.92 |
| 50010.5511 | 3133.67 |
| 50020.7912 | 3134.3 |
| 50031.0313 | 3134.83 |
| 50041.2714 | 3135.27 |
| 50051.5116 | 3135.64 |
| 50061.7517 | 3135.93 |
| 50071.9918 | 3136.15 |
| 50082.2319 | 3136.31 |
| 50092.472 | 3136.42 |
| 50102.7121 | 3136.49 |
| 50112.9522 | 3136.51 |
| 50123.1923 | 3136.53 |
| 50133.4324 | 3136.54 |
| 50143.6725 | 3136.58 |
| 50153.9126 | 3136.67 |
| 50164.1527 | 3136.82 |
| 50174.3928 | 3137.06 |
| 50184.6329 | 3137.41 |
| 50194.8731 | 3137.89 |
| 50205.1132 | 3138.52 |
| 50215.3533 | 3139.28 |
| 50225.5934 | 3140.15 |
| 50235.8335 | 3141.13 |
| 50246.0736 | 3142.18 |
| 50256.3137 | 3143.3 |
| 50266.5538 | 3144.46 |
| 50276.7939 | 3145.66 |
| 50287.034 | 3146.86 |
| 50297.2741 | 3148.06 |
| 50307.5142 | 3149.23 |
| 50317.7543 | 3150.36 |
| 50327.9945 | 3151.43 |
| 50338.2346 | 3152.43 |
| 50348.4747 | 3153.33 |
| 50358.7148 | 3154.12 |
| 50368.9549 | 3154.78 |
| 50379.195 | 3155.3 |
| 50389.4351 | 3155.68 |
| 50399.6752 | 3155.94 |
| 50409.9153 | 3156.07 |
| 50420.1554 | 3156.08 |
| 50430.3955 | 3156 |
| 50440.6356 | 3155.82 |
| 50450.8757 | 3155.55 |
| 50461.1159 | 3155.2 |
| 50471.356 | 3154.78 |
| 50481.5961 | 3154.31 |
| 50491.8362 | 3153.78 |
| 50502.0763 | 3153.2 |
| 50512.3164 | 3152.59 |
| 50522.5565 | 3151.95 |
| 50532.7966 | 3151.29 |
| 50543.0367 | 3150.63 |
| 50553.2768 | 3149.96 |
| 50563.5169 | 3149.3 |
| 50573.757 | 3148.65 |
| 50583.9971 | 3148.03 |
| 50594.2373 | 3147.44 |
| 50604.4774 | 3146.89 |
| 50614.7175 | 3146.39 |
| 50624.9576 | 3145.95 |
| 50635.1977 | 3145.57 |
| 50645.4378 | 3145.27 |
| 50655.6779 | 3145.06 |
| 50665.918 | 3144.93 |
| 50676.1581 | 3130.85 |
| 50686.3982 | 3130.85 |
| 50696.6383 | 3129.45 |
| 50706.8784 | 3129.45 |
| 50717.1185 | 3128.04 |
| 50727.3587 | 3125.22 |
| 50737.5988 | 3128.04 |
| 50747.8389 | 3128.04 |
| 50758.079 | 3128.04 |
| 50768.3191 | 3122.41 |
| 50778.5592 | 3128.04 |
| 50788.7993 | 3130.85 |
| 50799.0394 | 3130.85 |
| 50809.2795 | 3130.85 |
| 50819.5196 | 3132.26 |
| 50829.7597 | 3132.26 |
| 50839.9998 | 3130.85 |
| 50850.2399 | 3133.67 |
| 50860.48 | 3135.08 |
| 50870.7202 | 3132.26 |
| 50880.9603 | 3132.26 |
| 50891.2004 | 3139.3 |
| 50901.4405 | 3154.78 |
| 50911.6806 | 3140.71 |
| 50921.9207 | 3153.38 |
| 50932.1608 | 3154.78 |
| 50942.4009 | 3147.75 |
| 50952.641 | 3157.6 |
| 50962.8811 | 3159.01 |
| 50973.1212 | 3161.82 |
| 50983.3613 | 3164.64 |
| 50993.6014 | 3161.82 |
| 51003.8416 | 3164.64 |
| 51014.0817 | 3164.64 |
| 51024.3218 | 3170.27 |
| 51034.5619 | 3174.49 |
| 51044.802 | 3175.9 |
| 51055.0421 | 3177.31 |
| 51065.2822 | 3175.9 |
| 51075.5223 | 3173.08 |
| 51085.7624 | 3171.68 |
| 51096.0025 | 3171.68 |
| 51106.2426 | 3167.45 |
| 51116.4827 | 3164.64 |
| 51126.7228 | 3164.64 |
| 51136.963 | 3163.23 |
| 51147.2031 | 3161.82 |
| 51157.4432 | 3171.68 |
| 51167.6833 | 3167.45 |
| 51177.9234 | 3167.45 |
| 51188.1635 | 3166.05 |
| 51198.4036 | 3159.01 |
| 51208.6437 | 3159.01 |
| 51218.8838 | 3159.01 |
| 51229.1239 | 3157.6 |
| 51239.364 | 3156.19 |
| 51249.6041 | 3156.19 |
| 51259.8442 | 3156.19 |
| 51270.0844 | 3174.49 |
| 51280.3245 | 3171.68 |
| 51290.5646 | 3170.27 |
| 51300.8047 | 3170.27 |
| 51311.0448 | 3167.45 |
| 51321.2849 | 3166.05 |
| 51331.525 | 3166.05 |
| 51341.7651 | 3167.45 |
| 51352.0052 | 3161.82 |
| 51362.2453 | 3167.45 |
| 51372.4854 | 3161.82 |
| 51382.7255 | 3160.41 |
| 51392.9656 | 3160.41 |
| 51403.2057 | 3160.41 |
| 51413.4459 | 3160.41 |
| 51423.686 | 3161.82 |
| 51433.9261 | 3161.82 |
| 51444.1662 | 3163.23 |
| 51454.4063 | 3164.64 |
| 51464.6464 | 3169.77 |
| 51474.8865 | 3173.04 |
| 51485.1266 | 3174.57 |
| 51495.3667 | 3174.47 |
| 51505.6068 | 3172.84 |
| 51515.8469 | 3169.8 |
| 51526.087 | 3165.46 |
| 51536.3271 | 3159.92 |
| 51546.5673 | 3153.3 |
| 51556.8074 | 3145.7 |
| 51567.0475 | 3137.25 |
| 51577.2876 | 3128.04 |
| 51587.5277 | 3118.19 |
| 51597.7678 | 3107.8 |
| 51608.0079 | 3097 |
| 51618.248 | 3085.89 |
| 51628.4881 | 3074.57 |
| 51638.7282 | 3063.16 |
| 51648.9683 | 3051.78 |
| 51659.2084 | 3040.52 |
| 51669.4485 | 3029.51 |
| 51679.6887 | 3018.83 |
| 51689.9288 | 3008.57 |
| 51700.1689 | 2998.79 |
| 51710.409 | 2989.53 |
| 51720.6491 | 2980.88 |
| 51730.8892 | 2972.89 |
| 51741.1293 | 2965.62 |
| 51751.3694 | 2959.13 |
| 51761.6095 | 2953.39 |
| 51771.8496 | 2948.05 |
| 51782.0897 | 2942.64 |
| 51792.3298 | 2936.71 |
| 51802.5699 | 2929.79 |
| 51812.8101 | 2921.44 |
| 51823.0502 | 2911.19 |
| 51833.2903 | 2898.6 |
| 51843.5304 | 2883.53 |
| 51853.7705 | 2867.17 |
| 51864.0106 | 2851.04 |
| 51874.2507 | 2836.66 |
| 51884.4908 | 2825.24 |
| 51894.7309 | 2816.66 |
| 51904.971 | 2810.51 |
| 51915.2111 | 2806.37 |
| 51925.4512 | 2803.82 |
| 51935.6913 | 2802.43 |
| 51945.9315 | 2801.79 |
| 51956.1716 | 2801.47 |
| 51966.4117 | 2801.13 |
| 51976.6518 | 2800.72 |
| 51986.8919 | 2800.27 |
| 51997.132 | 2799.79 |
| 52007.3721 | 2799.33 |
| 52017.6122 | 2798.91 |
| 52027.8523 | 2798.55 |
| 52038.0924 | 2798.28 |
| 52048.3325 | 2798.13 |
| 52058.5726 | 2798.13 |
| 52068.8127 | 2798.29 |
| 52079.0529 | 2798.66 |
| 52089.293 | 2799.24 |
| 52099.5331 | 2800.04 |
| 52109.7732 | 2801.03 |
| 52120.0133 | 2802.22 |
| 52130.2534 | 2803.57 |
| 52140.4935 | 2805.09 |
| 52150.7336 | 2806.75 |
| 52160.9737 | 2808.55 |
| 52171.2138 | 2810.47 |
| 52181.4539 | 2812.5 |
| 52191.694 | 2814.62 |
| 52201.9341 | 2816.82 |
| 52212.1742 | 2819.09 |
| 52222.4144 | 2821.42 |
| 52232.6545 | 2823.79 |
| 52242.8946 | 2826.19 |
| 52253.1347 | 2828.61 |
| 52263.3748 | 2831.03 |
| 52273.6149 | 2833.45 |
| 52283.855 | 2835.85 |
| 52294.0951 | 2838.26 |
| 52304.3352 | 2840.66 |
| 52314.5753 | 2843.07 |
| 52324.8154 | 2845.49 |
| 52335.0555 | 2847.91 |
| 52345.2956 | 2850.35 |
| 52355.5358 | 2852.81 |
| 52365.7759 | 2855.28 |
| 52376.016 | 2857.78 |
| 52386.2561 | 2860.3 |
| 52396.4962 | 2862.85 |
| 52406.7363 | 2865.43 |
| 52416.9764 | 2868.04 |
| 52427.2165 | 2870.68 |
| 52437.4566 | 2873.36 |
| 52447.6967 | 2876.06 |
| 52457.9368 | 2878.81 |
| 52468.1769 | 2881.58 |
| 52478.417 | 2884.4 |
| 52488.6572 | 2887.26 |
| 52498.8973 | 2890.15 |
| 52509.1374 | 2893.09 |
| 52519.3775 | 2896.09 |
| 52529.6176 | 2899.16 |
| 52539.8577 | 2902.31 |
| 52550.0978 | 2905.57 |
| 52560.3379 | 2908.95 |
| 52570.578 | 2912.46 |
| 52580.8181 | 2916.13 |
| 52591.0582 | 2919.95 |
| 52601.2983 | 2923.96 |
| 52611.5384 | 2928.16 |
| 52621.7786 | 2932.56 |
| 52632.0187 | 2937.11 |
| 52642.2588 | 2941.77 |
| 52652.4989 | 2946.47 |
| 52662.739 | 2951.16 |
| 52672.9791 | 2955.79 |
| 52683.2192 | 2960.29 |
| 52693.4593 | 2964.63 |
| 52703.6994 | 2968.73 |
| 52713.9395 | 2972.54 |
| 52724.1796 | 2976.02 |
| 52734.4197 | 2979.11 |
| 52744.6598 | 2981.82 |
| 52754.9 | 2984.18 |
| 52765.1401 | 2986.19 |
| 52775.3802 | 2987.87 |
| 52785.6203 | 2989.25 |
| 52795.8604 | 2990.34 |
| 52806.1005 | 2991.16 |
| 52816.3406 | 2991.73 |
| 52826.5807 | 2992.05 |
| 52836.8208 | 2992.16 |
| 52847.0609 | 2992.07 |
| 52857.301 | 2991.79 |
| 52867.5411 | 2991.35 |
| 52877.7812 | 2990.76 |
| 52888.0213 | 2990.04 |
| 52898.2615 | 2989.21 |
| 52908.5016 | 2988.28 |
| 52918.7417 | 2987.28 |
| 52928.9818 | 2986.21 |
| 52939.2219 | 2985.12 |
| 52949.462 | 2984.01 |
| 52959.7021 | 2982.92 |
| 52969.9422 | 2981.87 |
| 52980.1823 | 2980.89 |
| 52990.4224 | 2979.99 |
| 53000.6625 | 2979.22 |
| 53010.9026 | 2978.59 |
| 53021.1427 | 2978.12 |
| 53031.3829 | 2977.85 |
| 53041.623 | 2977.79 |
| 53051.8631 | 2977.97 |
| 53062.1032 | 2978.43 |
| 53072.3433 | 2979.17 |
| 53082.5834 | 2980.24 |
| 53092.8235 | 2981.65 |
| 53103.0636 | 2983.41 |
| 53113.3037 | 2985.46 |
| 53123.5438 | 2987.73 |
| 53133.7839 | 2990.14 |
| 53144.024 | 2992.61 |
| 53154.2641 | 2995.07 |
| 53164.5043 | 2997.44 |
| 53174.7444 | 2999.65 |
| 53184.9845 | 3001.62 |
| 53195.2246 | 3003.27 |
| 53205.4647 | 3004.53 |
| 53215.7048 | 3005.33 |
| 53225.9449 | 3005.57 |
| 53236.185 | 3005.2 |
| 53246.4251 | 3004.13 |
| 53256.6652 | 3002.29 |
| 53266.9053 | 2999.6 |
| 53277.1454 | 2995.99 |
| 53287.3855 | 2991.37 |
| 53297.6257 | 2985.68 |
| 53307.8658 | 2978.83 |
| 53318.1059 | 2970.81 |
| 53328.346 | 2961.76 |
| 53338.5861 | 2951.9 |
| 53348.8262 | 2941.43 |
| 53359.0663 | 2930.57 |
| 53369.3064 | 2919.52 |
| 53379.5465 | 2908.5 |
| 53389.7866 | 2897.7 |
| 53400.0267 | 2887.34 |
| 53410.2668 | 2877.59 |
| 53420.5069 | 2868.49 |
| 53430.7471 | 2860.04 |
| 53440.9872 | 2852.24 |
| 53451.2273 | 2845.11 |
| 53461.4674 | 2838.63 |
| 53471.7075 | 2832.79 |
| 53481.9476 | 2827.55 |
| 53492.1877 | 2822.88 |
| 53502.4278 | 2818.76 |
| 53512.6679 | 2815.15 |
| 53522.908 | 2812.04 |
| 53533.1481 | 2809.38 |
| 53543.3882 | 2807.15 |
| 53553.6283 | 2805.32 |
| 53563.8685 | 2803.85 |
| 53574.1086 | 2802.73 |
| 53584.3487 | 2801.92 |
| 53594.5888 | 2801.4 |
| 53604.8289 | 2801.13 |
| 53615.069 | 2801.08 |
| 53625.3091 | 2801.22 |
| 53635.5492 | 2801.53 |
| 53645.7893 | 2801.98 |
| 53656.0294 | 2802.54 |
| 53666.2695 | 2803.17 |
| 53676.5096 | 2803.85 |
| 53686.7497 | 2804.55 |
| 53696.9898 | 2805.25 |
| 53707.23 | 2805.9 |
| 53717.4701 | 2806.48 |
| 53727.7102 | 2806.97 |
| 53737.9503 | 2807.33 |
| 53748.1904 | 2807.54 |
| 53758.4305 | 2807.56 |
| 53768.6706 | 2807.36 |
| 53778.9107 | 2806.93 |
| 53789.1508 | 2806.22 |
| 53799.3909 | 2805.2 |
| 53809.631 | 2803.86 |
| 53819.8711 | 2802.16 |
| 53830.1112 | 2800.07 |
| 53840.3514 | 2797.57 |
| 53850.5915 | 2794.74 |
| 53860.8316 | 2791.66 |
| 53871.0717 | 2788.41 |
| 53881.3118 | 2785.06 |
| 53891.5519 | 2781.71 |
| 53901.792 | 2778.44 |
| 53912.0321 | 2775.32 |
| 53922.2722 | 2772.45 |
| 53932.5123 | 2769.9 |
| 53942.7524 | 2767.75 |
| 53952.9925 | 2766.1 |
| 53963.2326 | 2765.01 |
| 53973.4728 | 2764.57 |
| 53983.7129 | 2764.87 |
| 53993.953 | 2765.96 |
| 54004.1931 | 2767.77 |
| 54014.4332 | 2770.21 |
| 54024.6733 | 2773.17 |
| 54034.9134 | 2776.56 |
| 54045.1535 | 2780.29 |
| 54055.3936 | 2784.25 |
| 54065.6337 | 2788.35 |
| 54075.8738 | 2792.49 |
| 54086.1139 | 2796.58 |
| 54096.354 | 2800.52 |
| 54106.5942 | 2804.21 |
| 54116.8343 | 2807.55 |
| 54127.0744 | 2810.46 |
| 54137.3145 | 2812.82 |
| 54147.5546 | 2814.55 |
| 54157.7947 | 2815.55 |
| 54168.0348 | 2815.78 |
| 54178.2749 | 2815.43 |
| 54188.515 | 2814.78 |
| 54198.7551 | 2814.07 |
| 54208.9952 | 2813.56 |
| 54219.2353 | 2813.52 |
| 54229.4754 | 2814.2 |
| 54239.7156 | 2815.86 |
| 54249.9557 | 2818.76 |
| 54260.1958 | 2823.16 |
| 54270.4359 | 2829.31 |
| 54280.676 | 2837.48 |
| 54290.9161 | 2847.92 |
| 54301.1562 | 2860.6 |
| 54311.3963 | 2874.29 |
| 54321.6364 | 2887.46 |
| 54331.8765 | 2898.6 |
| 54342.1166 | 2906.56 |
| 54352.3567 | 2911.72 |
| 54362.5968 | 2914.83 |
| 54372.837 | 2916.67 |
| 54383.0771 | 2917.97 |
| 54393.3172 | 2919.51 |
| 54403.5573 | 2922.03 |
| 54413.7974 | 2926.3 |
| 54424.0375 | 2933.08 |
| 54434.2776 | 2943.12 |
| 54444.5177 | 2957.18 |
| 54454.7578 | 2976.02 |
| 54464.9979 | 2999.49 |
| 54475.238 | 3023.88 |
| 54485.4781 | 3045.35 |
| 54495.7182 | 3063.38 |
| 54505.9583 | 3078.21 |
| 54516.1985 | 3090.12 |
| 54526.4386 | 3099.37 |
| 54536.6787 | 3106.22 |
| 54546.9188 | 3110.94 |
| 54557.1589 | 3113.8 |
| 54567.399 | 3115.05 |
| 54577.6391 | 3114.97 |
| 54587.8792 | 3113.82 |
| 54598.1193 | 3111.87 |
| 54608.3594 | 3109.37 |
| 54618.5995 | 3106.6 |
| 54628.8396 | 3103.82 |
| 54639.0797 | 3101.29 |
| 54649.3199 | 3099.24 |
| 54659.56 | 3097.66 |
| 54669.8001 | 3096.53 |
| 54680.0402 | 3095.79 |
| 54690.2803 | 3095.42 |
| 54700.5204 | 3095.38 |
| 54710.7605 | 3095.62 |
| 54721.0006 | 3096.1 |
| 54731.2407 | 3096.79 |
| 54741.4808 | 3097.65 |
| 54751.7209 | 3098.63 |
| 54761.961 | 3099.71 |
| 54772.2011 | 3100.83 |
| 54782.4413 | 3101.97 |
| 54792.6814 | 3103.08 |
| 54802.9215 | 3104.11 |
| 54813.1616 | 3105.05 |
| 54823.4017 | 3105.83 |
| 54833.6418 | 3106.43 |
| 54843.8819 | 3106.81 |
| 54854.122 | 3106.93 |
| 54864.3621 | 3106.75 |
| 54874.6022 | 3106.31 |
| 54884.8423 | 3105.64 |
| 54895.0824 | 3104.79 |
| 54905.3225 | 3103.8 |
| 54915.5627 | 3102.69 |
| 54925.8028 | 3101.52 |
| 54936.0429 | 3100.31 |
| 54946.283 | 3099.12 |
| 54956.5231 | 3097.97 |
| 54966.7632 | 3096.91 |
| 54977.0033 | 3095.97 |
| 54987.2434 | 3095.2 |
| 54997.4835 | 3094.63 |
| 55007.7236 | 3094.3 |
| 55017.9637 | 3094.26 |
| 55028.2038 | 3094.52 |
| 55038.4439 | 3095.08 |
| 55048.6841 | 3095.92 |
| 55058.9242 | 3097.01 |
| 55069.1643 | 3098.33 |
| 55079.4044 | 3099.85 |
| 55089.6445 | 3101.56 |
| 55099.8846 | 3103.43 |
| 55110.1247 | 3105.44 |
| 55120.3648 | 3107.57 |
| 55130.6049 | 3109.79 |
| 55140.845 | 3112.08 |
| 55151.0851 | 3114.42 |
| 55161.3252 | 3116.79 |
| 55171.5653 | 3119.16 |
| 55181.8055 | 3121.51 |
| 55192.0456 | 3123.82 |
| 55202.2857 | 3126.06 |
| 55212.5258 | 3128.2 |
| 55222.7659 | 3130.22 |
| 55233.006 | 3132.07 |
| 55243.2461 | 3133.72 |
| 55253.4862 | 3135.15 |
| 55263.7263 | 3136.31 |
| 55273.9664 | 3137.18 |
| 55284.2065 | 3137.72 |
| 55294.4466 | 3137.89 |
| 55304.6867 | 3137.69 |
| 55314.9268 | 3137.11 |
| 55325.167 | 3136.19 |
| 55335.4071 | 3134.94 |
| 55345.6472 | 3133.4 |
| 55355.8873 | 3131.59 |
| 55366.1274 | 3129.53 |
| 55376.3675 | 3127.24 |
| 55386.6076 | 3124.76 |
| 55396.8477 | 3122.1 |
| 55407.0878 | 3119.29 |
| 55417.3279 | 3116.35 |
| 55427.568 | 3113.32 |
| 55437.8081 | 3110.2 |
| 55448.0482 | 3107.04 |
| 55458.2884 | 3103.84 |
| 55468.5285 | 3100.64 |
| 55478.7686 | 3097.46 |
| 55489.0087 | 3094.33 |
| 55499.2488 | 3091.26 |
| 55509.4889 | 3088.29 |
| 55519.729 | 3085.44 |
| 55529.9691 | 3082.73 |
| 55540.2092 | 3080.18 |
| 55550.4493 | 3077.82 |
| 55560.6894 | 3075.64 |
| 55570.9295 | 3073.64 |
| 55581.1696 | 3071.8 |
| 55591.4098 | 3070.11 |
| 55601.6499 | 3068.57 |
| 55611.89 | 3067.17 |
| 55622.1301 | 3065.89 |
| 55632.3702 | 3064.74 |
| 55642.6103 | 3063.69 |
| 55652.8504 | 3062.74 |
| 55663.0905 | 3061.88 |
| 55673.3306 | 3061.1 |
| 55683.5707 | 3060.38 |
| 55693.8108 | 3059.69 |
| 55704.0509 | 3059.01 |
| 55714.291 | 3058.3 |
| 55724.5312 | 3057.55 |
| 55734.7713 | 3056.72 |
| 55745.0114 | 3055.8 |
| 55755.2515 | 3054.76 |
| 55765.4916 | 3053.56 |
| 55775.7317 | 3052.19 |
| 55785.9718 | 3050.62 |
| 55796.2119 | 3048.83 |
| 55806.452 | 3046.85 |
| 55816.6921 | 3044.72 |
| 55826.9322 | 3042.45 |
| 55837.1723 | 3040.09 |
| 55847.4124 | 3037.68 |
| 55857.6526 | 3035.24 |
| 55867.8927 | 3032.81 |
| 55878.1328 | 3030.41 |
| 55888.3729 | 3028.1 |
| 55898.613 | 3025.89 |
| 55908.8531 | 3023.78 |
| 55919.0932 | 3021.79 |
| 55929.3333 | 3019.91 |
| 55939.5734 | 3018.14 |
| 55949.8135 | 3016.48 |
| 55960.0536 | 3014.93 |
| 55970.2937 | 3013.5 |
| 55980.5338 | 3012.19 |
| 55990.774 | 3010.99 |
| 56001.0141 | 3009.9 |
| 56011.2542 | 3008.94 |
| 56021.4943 | 3008.09 |
| 56031.7344 | 3007.36 |
| 56041.9745 | 3006.75 |
| 56052.2146 | 3006.26 |
| 56062.4547 | 3005.89 |
| 56072.6948 | 3005.65 |
| 56082.9349 | 3005.52 |
| 56093.175 | 3005.52 |
| 56103.4151 | 3005.65 |
| 56113.6552 | 3005.9 |
| 56123.8954 | 3006.27 |
| 56134.1355 | 3006.77 |
| 56144.3756 | 3007.4 |
| 56154.6157 | 3008.16 |
| 56164.8558 | 3009.04 |
| 56175.0959 | 3010.06 |
| 56185.336 | 3011.21 |
| 56195.5761 | 3012.48 |
| 56205.8162 | 3013.87 |
| 56216.0563 | 3015.35 |
| 56226.2964 | 3016.9 |
| 56236.5365 | 3018.51 |
| 56246.7766 | 3020.16 |
| 56257.0167 | 3021.82 |
| 56267.2569 | 3023.48 |
| 56277.497 | 3025.12 |
| 56287.7371 | 3026.72 |
| 56297.9772 | 3028.25 |
| 56308.2173 | 3029.71 |
| 56318.4574 | 3031.08 |
| 56328.6975 | 3032.32 |
| 56338.9376 | 3033.43 |
| 56349.1777 | 3034.39 |
| 56359.4178 | 3035.18 |
| 56369.6579 | 3035.79 |
| 56379.898 | 3036.21 |
| 56390.1381 | 3036.41 |
| 56400.3783 | 3036.39 |
| 56410.6184 | 3036.12 |
| 56420.8585 | 3035.59 |
| 56431.0986 | 3034.8 |
| 56441.3387 | 3033.71 |
| 56451.5788 | 3032.32 |
| 56461.8189 | 3030.61 |
| 56472.059 | 3028.57 |
| 56482.2991 | 3026.18 |
| 56492.5392 | 3023.43 |
| 56502.7793 | 3020.3 |
| 56513.0194 | 3016.77 |
| 56523.2595 | 3012.83 |
| 56533.4997 | 3008.47 |
| 56543.7398 | 3003.67 |
| 56553.9799 | 2998.41 |
| 56564.22 | 2992.68 |
| 56574.4601 | 2986.47 |
| 56584.7002 | 2979.75 |
| 56594.9403 | 2972.52 |
| 56605.1804 | 2964.76 |
| 56615.4205 | 2945.29 |
| 56625.6606 | 2928.42 |
| 56635.9007 | 2913.89 |
| 56646.1408 | 2901.41 |
| 56656.3809 | 2890.73 |
| 56666.6211 | 2881.58 |
| 56676.8612 | 2873.68 |
| 56687.1013 | 2866.77 |
| 56697.3414 | 2860.58 |
| 56707.5815 | 2854.84 |
| 56717.8216 | 2849.28 |
| 56728.0617 | 2843.64 |
| 56738.3018 | 2837.65 |
| 56748.5419 | 2831.03 |
| 56758.782 | 2823.62 |
| 56769.0221 | 2815.59 |
| 56779.2622 | 2807.24 |
| 56789.5023 | 2798.84 |
| 56799.7425 | 2790.67 |
| 56809.9826 | 2783 |
| 56820.2227 | 2776.14 |
| 56830.4628 | 2770.28 |
| 56840.7029 | 2765.42 |
| 56850.943 | 2761.49 |
| 56861.1831 | 2758.42 |
| 56871.4232 | 2756.13 |
| 56881.6633 | 2754.55 |
| 56891.9034 | 2753.61 |
| 56902.1435 | 2753.24 |
| 56912.3836 | 2753.36 |
| 56922.6237 | 2753.9 |
| 56932.8639 | 2754.79 |
| 56943.104 | 2755.97 |
| 56953.3441 | 2757.34 |
| 56963.5842 | 2758.85 |
| 56973.8243 | 2760.43 |
| 56984.0644 | 2761.99 |
| 56994.3045 | 2763.47 |
| 57004.5446 | 2764.81 |
| 57014.7847 | 2766.06 |
| 57025.0248 | 2767.25 |
| 57035.2649 | 2768.45 |
| 57045.505 | 2769.71 |
| 57055.7451 | 2771.08 |
| 57065.9853 | 2772.62 |
| 57076.2254 | 2774.37 |
| 57086.4655 | 2776.4 |
| 57096.7056 | 2778.75 |
| 57106.9457 | 2781.48 |
| 57117.1858 | 2784.64 |
| 57127.4259 | 2788.29 |
| 57137.666 | 2792.47 |
| 57147.9061 | 2797.25 |
| 57158.1462 | 2802.62 |
| 57168.3863 | 2808.38 |
| 57178.6264 | 2814.26 |
| 57188.8665 | 2820.01 |
| 57199.1067 | 2825.36 |
| 57209.3468 | 2830.06 |
| 57219.5869 | 2833.85 |
| 57229.827 | 2836.52 |
| 57240.0671 | 2838.12 |
| 57250.3072 | 2838.75 |
| 57260.5473 | 2838.5 |
| 57270.7874 | 2837.47 |
| 57281.0275 | 2835.78 |
| 57291.2676 | 2833.51 |
| 57301.5077 | 2830.76 |
| 57311.7478 | 2827.64 |
| 57321.9879 | 2824.25 |
| 57332.228 | 2820.68 |
| 57342.4682 | 2817.03 |
| 57352.7083 | 2813.41 |
| 57362.9484 | 2809.92 |
| 57373.1885 | 2806.64 |
| 57383.4286 | 2803.64 |
| 57393.6687 | 2800.96 |
| 57403.9088 | 2798.65 |
| 57414.1489 | 2796.76 |
| 57424.389 | 2795.35 |
| 57434.6291 | 2794.46 |
| 57444.8692 | 2794.14 |
| 57455.1093 | 2794.43 |
| 57465.3494 | 2795.38 |
| 57475.5896 | 2796.88 |
| 57485.8297 | 2798.85 |
| 57496.0698 | 2801.17 |
| 57506.3099 | 2803.73 |
| 57516.55 | 2806.44 |
| 57526.7901 | 2809.19 |
| 57537.0302 | 2811.86 |
| 57547.2703 | 2814.36 |
| 57557.5104 | 2816.59 |
| 57567.7505 | 2818.42 |
| 57577.9906 | 2819.77 |
| 57588.2307 | 2820.55 |
| 57598.4708 | 2820.79 |
| 57608.711 | 2820.56 |
| 57618.9511 | 2819.92 |
| 57629.1912 | 2818.92 |
| 57639.4313 | 2817.62 |
| 57649.6714 | 2816.1 |
| 57659.9115 | 2814.4 |
| 57670.1516 | 2812.59 |
| 57680.3917 | 2810.73 |
| 57690.6318 | 2808.88 |
| 57700.8719 | 2807.1 |
| 57711.112 | 2805.45 |
| 57721.3521 | 2803.93 |
| 57731.5922 | 2802.55 |
| 57741.8324 | 2801.33 |
| 57752.0725 | 2800.27 |
| 57762.3126 | 2799.38 |
| 57772.5527 | 2798.66 |
| 57782.7928 | 2798.12 |
| 57793.0329 | 2797.77 |
| 57803.273 | 2797.62 |
| 57813.5131 | 2797.67 |
| 57823.7532 | 2797.94 |
| 57833.9933 | 2798.42 |
| 57844.2334 | 2799.13 |
| 57854.4735 | 2800.07 |
| 57864.7136 | 2801.24 |
| 57874.9538 | 2802.67 |
| 57885.1939 | 2804.33 |
| 57895.434 | 2806.25 |
| 57905.6741 | 2808.42 |
| 57915.9142 | 2810.84 |
| 57926.1543 | 2813.51 |
| 57936.3944 | 2816.45 |
| 57946.6345 | 2819.65 |
| 57956.8746 | 2823.11 |
| 57967.1147 | 2826.84 |
| 57977.3548 | 2830.84 |
| 57987.5949 | 2835.11 |
| 57997.835 | 2839.65 |
| 58008.0752 | 2844.47 |
| 58018.3153 | 2849.58 |
| 58028.5554 | 2854.96 |
| 58038.7955 | 2860.63 |
| 58049.0356 | 2866.57 |
| 58059.2757 | 2872.76 |
| 58069.5158 | 2879.2 |
| 58079.7559 | 2885.86 |
| 58089.996 | 2892.73 |
| 58100.2361 | 2899.8 |
| 58110.4762 | 2907.04 |
| 58120.7163 | 2914.45 |
| 58130.9564 | 2922 |
| 58141.1966 | 2929.64 |
| 58151.4367 | 2937.37 |
| 58161.6768 | 2945.13 |
| 58171.9169 | 2952.91 |
| 58182.157 | 2960.67 |
| 58192.3971 | 2968.38 |
| 58202.6372 | 2976.02 |
| 58212.8773 | 2983.54 |
| 58223.1174 | 2990.93 |
| 58233.3575 | 2998.15 |
| 58243.5976 | 3005.17 |
| 58253.8377 | 3011.95 |
| 58264.0778 | 3018.48 |
| 58274.318 | 3024.72 |
| 58284.5581 | 3030.63 |
| 58294.7982 | 3036.19 |
| 58305.0383 | 3041.37 |
| 58315.2784 | 3046.14 |
| 58325.5185 | 3050.46 |
| 58335.7586 | 3054.32 |
| 58345.9987 | 3057.66 |
| 58356.2388 | 3060.47 |
| 58366.4789 | 3060.47 |
| 58376.719 | 3060.47 |
| 58386.9591 | 3064.7 |
| 58397.1992 | 3064.7 |
| 58407.4393 | 3066.1 |
| 58417.6795 | 3066.1 |
| 58427.9196 | 3068.92 |
| 58438.1597 | 3068.92 |
| 58448.3998 | 3070.33 |
| 58458.6399 | 3071.73 |
| 58468.88 | 3071.73 |
| 58479.1201 | 3070.33 |
| 58489.3602 | 3074.55 |
| 58499.6003 | 3071.73 |
| 58509.8404 | 3073.14 |
| 58520.0805 | 3073.14 |
| 58530.3206 | 3073.14 |
| 58540.5607 | 3075.96 |
| 58550.8009 | 3075.96 |
| 58561.041 | 3077.37 |
| 58571.2811 | 3078.77 |
| 58581.5212 | 3080.18 |
| 58591.7613 | 3081.59 |
| 58602.0014 | 3081.59 |
| 58612.2415 | 3122.41 |
| 58622.4816 | 3121 |
| 58632.7217 | 3115.37 |
| 58642.9618 | 3115.37 |
| 58653.2019 | 3095.66 |
| 58663.442 | 3116.78 |
| 58673.6821 | 3115.37 |
| 58683.9223 | 3116.78 |
| 58694.1624 | 3118.19 |
| 58704.4025 | 3146.34 |
| 58714.6426 | 3142.12 |
| 58724.8827 | 3144.93 |
| 58735.1228 | 3146.34 |
| 58745.3629 | 3146.34 |
| 58755.603 | 3140.71 |
| 58765.8431 | 3140.71 |
| 58776.0832 | 3112.56 |
| 58786.3233 | 3115.37 |
| 58796.5634 | 3113.96 |
| 58806.8035 | 3112.56 |
| 58817.0437 | 3111.15 |
| 58827.2838 | 3109.74 |
| 58837.5239 | 3109.74 |
| 58847.764 | 3106.93 |
| 58858.0041 | 3108.33 |
| 58868.2442 | 3106.93 |
| 58878.4843 | 3099.89 |
| 58888.7244 | 3098.48 |
| 58898.9645 | 3098.48 |
| 58909.2046 | 3098.48 |
| 58919.4447 | 3092.85 |
| 58929.6848 | 3092.85 |
| 58939.9249 | 3091.44 |
| 58950.1651 | 3091.44 |
| 58960.4052 | 3091.44 |
| 58970.6453 | 3091.44 |
| 58980.8854 | 3091.44 |
| 58991.1255 | 3087.22 |
| 59001.3656 | 3094.26 |
| 59011.6057 | 3092.85 |
| 59021.8458 | 3088.63 |
| 59032.0859 | 3088.63 |
| 59042.326 | 3085.81 |
| 59052.5661 | 3087.22 |
| 59062.8062 | 3085.81 |
| 59073.0463 | 3084.4 |
| 59083.2865 | 3085.81 |
| 59093.5266 | 3078.77 |
| 59103.7667 | 3077.37 |
| 59114.0068 | 3077.37 |
| 59124.2469 | 3077.37 |
| 59134.487 | 3077.37 |
| 59144.7271 | 3085.81 |
| 59154.9672 | 3098.48 |
| 59165.2073 | 3091.44 |
| 59175.4474 | 3092.85 |
| 59185.6875 | 3094.26 |
| 59195.9276 | 3088.63 |
| 59206.1677 | 3088.63 |
| 59216.4079 | 3088.63 |
| 59226.648 | 3087.22 |
| 59236.8881 | 3087.22 |
| 59247.1282 | 3087.22 |
| 59257.3683 | 3085.81 |
| 59267.6084 | 3085.81 |
| 59276.3671 | 3075.96 |